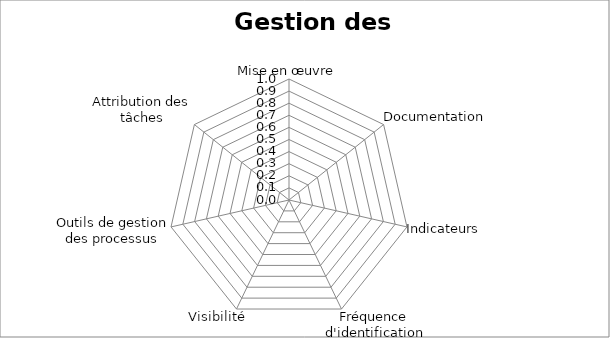
| Category | - - - - - - - |
|---|---|
| Mise en œuvre | 0 |
| Documentation | 0 |
| Indicateurs    | 0 |
| Fréquence d'identification des opportunités | 0 |
| Visibilité | 0 |
| Outils de gestion des processus | 0 |
| Attribution des tâches | 0 |